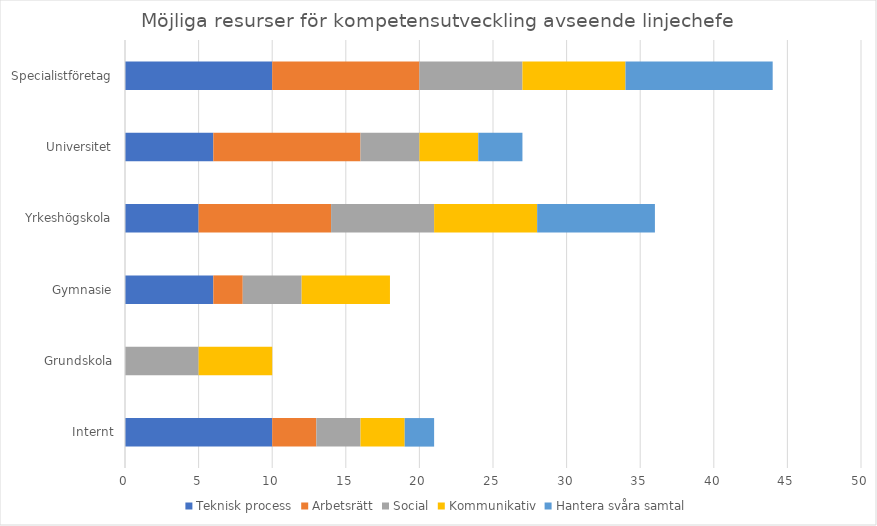
| Category | Teknisk process | Arbetsrätt | Social | Kommunikativ | Hantera svåra samtal |
|---|---|---|---|---|---|
| Internt | 10 | 3 | 3 | 3 | 2 |
| Grundskola | 0 | 0 | 5 | 5 | 0 |
| Gymnasie | 6 | 2 | 4 | 6 | 0 |
| Yrkeshögskola | 5 | 9 | 7 | 7 | 8 |
| Universitet | 6 | 10 | 4 | 4 | 3 |
| Specialistföretag | 10 | 10 | 7 | 7 | 10 |